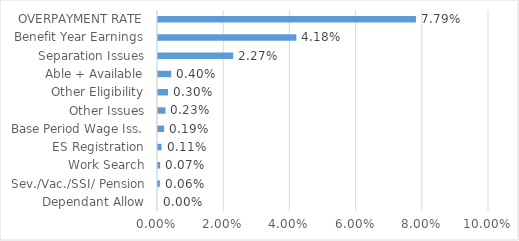
| Category | Series 0 |
|---|---|
| Dependant Allow | 0 |
| Sev./Vac./SSI/ Pension | 0.001 |
| Work Search | 0.001 |
| ES Registration | 0.001 |
| Base Period Wage Iss. | 0.002 |
| Other Issues | 0.002 |
| Other Eligibility | 0.003 |
| Able + Available | 0.004 |
| Separation Issues | 0.023 |
| Benefit Year Earnings | 0.042 |
| OVERPAYMENT RATE | 0.078 |